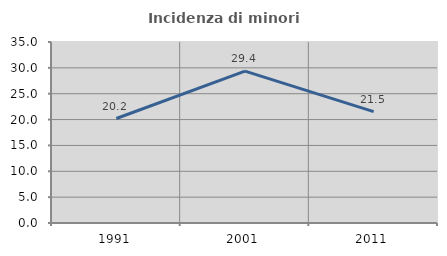
| Category | Incidenza di minori stranieri |
|---|---|
| 1991.0 | 20.202 |
| 2001.0 | 29.358 |
| 2011.0 | 21.538 |